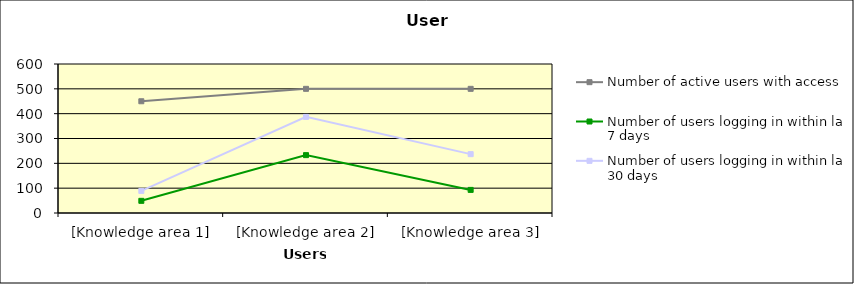
| Category | Number of active users with access | Number of users logging in within last 7 days | Number of users logging in within last 30 days |
|---|---|---|---|
| [Knowledge area 1] | 450 | 49 | 89 |
| [Knowledge area 2] | 500 | 233 | 387 |
| [Knowledge area 3] | 500 | 93 | 237 |